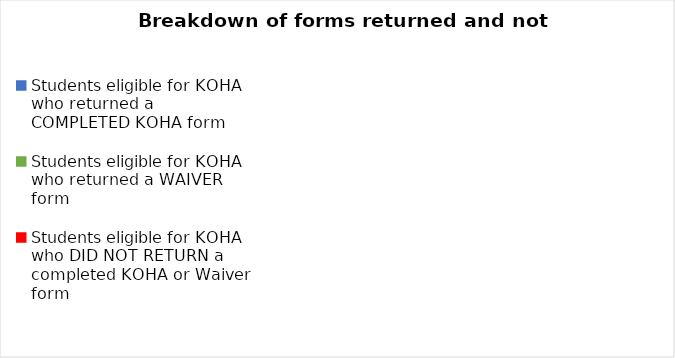
| Category | Series 0 |
|---|---|
| Students eligible for KOHA who returned a COMPLETED KOHA form | 0 |
| Students eligible for KOHA who returned a WAIVER form | 0 |
| Students eligible for KOHA who DID NOT RETURN a completed KOHA or Waiver form  | 0 |